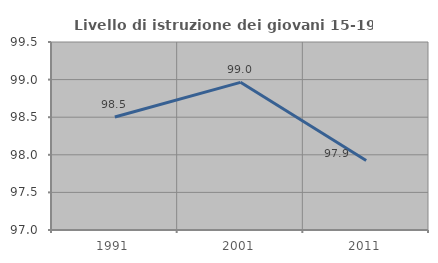
| Category | Livello di istruzione dei giovani 15-19 anni |
|---|---|
| 1991.0 | 98.503 |
| 2001.0 | 98.964 |
| 2011.0 | 97.925 |